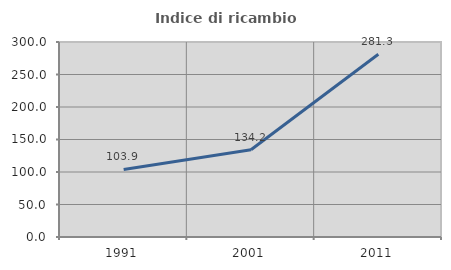
| Category | Indice di ricambio occupazionale  |
|---|---|
| 1991.0 | 103.855 |
| 2001.0 | 134.232 |
| 2011.0 | 281.25 |